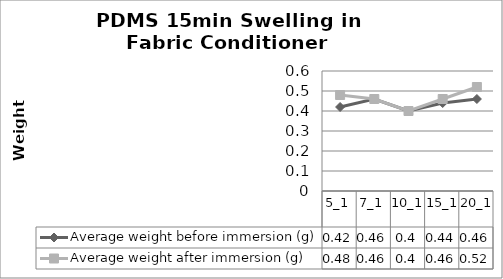
| Category | Average weight before immersion (g) | Average weight after immersion (g) |
|---|---|---|
| 5_1 | 0.42 | 0.48 |
| 7_1 | 0.46 | 0.46 |
| 10_1 | 0.4 | 0.4 |
| 15_1 | 0.44 | 0.46 |
| 20_1 | 0.46 | 0.52 |